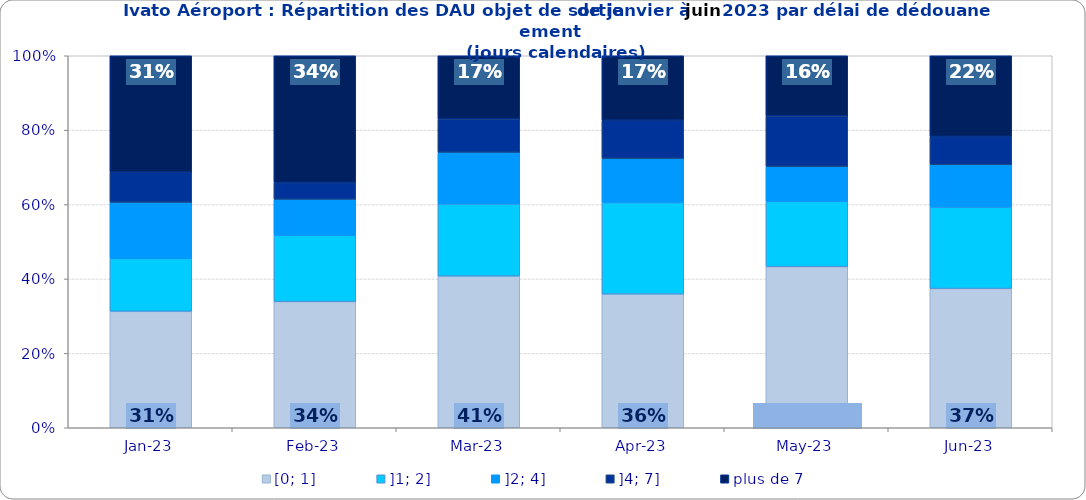
| Category | [0; 1] | ]1; 2] | ]2; 4] | ]4; 7] | plus de 7 |
|---|---|---|---|---|---|
| 2023-01-01 | 0.313 | 0.142 | 0.151 | 0.081 | 0.313 |
| 2023-02-01 | 0.339 | 0.178 | 0.097 | 0.045 | 0.341 |
| 2023-03-01 | 0.408 | 0.194 | 0.139 | 0.09 | 0.17 |
| 2023-04-01 | 0.359 | 0.246 | 0.119 | 0.103 | 0.173 |
| 2023-05-01 | 0.433 | 0.176 | 0.094 | 0.136 | 0.162 |
| 2023-06-01 | 0.374 | 0.219 | 0.114 | 0.076 | 0.217 |